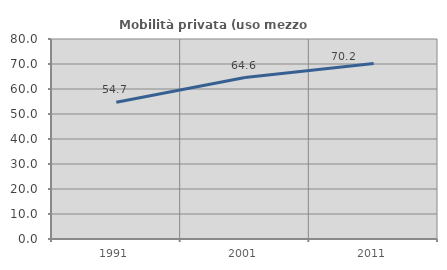
| Category | Mobilità privata (uso mezzo privato) |
|---|---|
| 1991.0 | 54.694 |
| 2001.0 | 64.58 |
| 2011.0 | 70.219 |